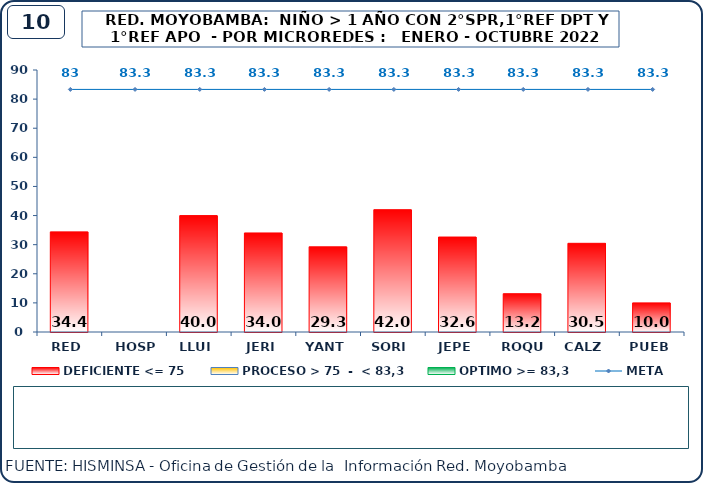
| Category | DEFICIENTE <= 75 | PROCESO > 75  -  < 83,3 | OPTIMO >= 83,3 |
|---|---|---|---|
| RED | 34.4 | 0 | 0 |
| HOSP | 0 | 0 | 0 |
| LLUI | 40 | 0 | 0 |
| JERI | 34.02 | 0 | 0 |
| YANT | 29.28 | 0 | 0 |
| SORI | 42.03 | 0 | 0 |
| JEPE | 32.62 | 0 | 0 |
| ROQU | 13.17 | 0 | 0 |
| CALZ | 30.46 | 0 | 0 |
| PUEB | 10 | 0 | 0 |